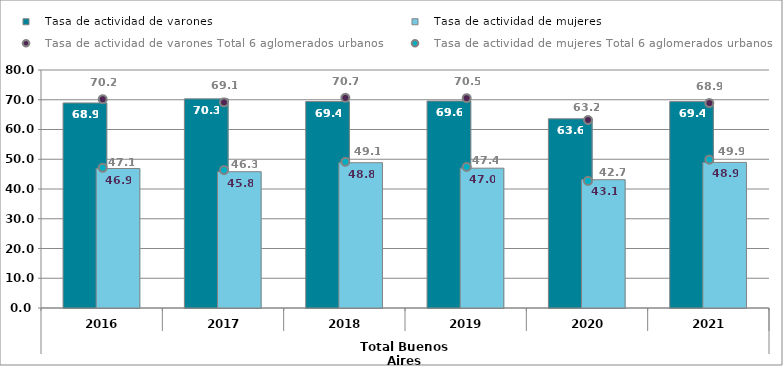
| Category |    Tasa de actividad de varones |    Tasa de actividad de mujeres |
|---|---|---|
| 0 | 68.92 | 46.89 |
| 1 | 70.3 | 45.81 |
| 2 | 69.4 | 48.84 |
| 3 | 69.56 | 47 |
| 4 | 63.6 | 43.13 |
| 5 | 69.38 | 48.94 |